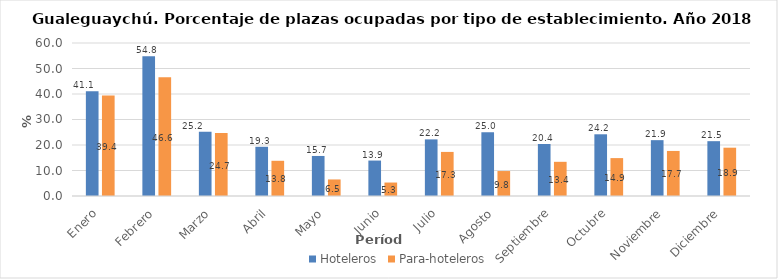
| Category | Hoteleros | Para-hoteleros |
|---|---|---|
| Enero | 41.1 | 39.364 |
| Febrero | 54.8 | 46.604 |
| Marzo | 25.2 | 24.697 |
| Abril | 19.3 | 13.806 |
| Mayo | 15.7 | 6.489 |
| Junio | 13.9 | 5.281 |
| Julio | 22.2 | 17.286 |
| Agosto | 25 | 9.791 |
| Septiembre | 20.4 | 13.406 |
| Octubre | 24.2 | 14.86 |
| Noviembre | 21.9 | 17.668 |
| Diciembre | 21.5 | 18.944 |